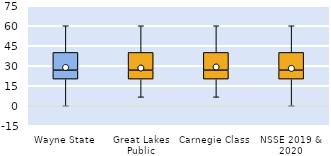
| Category | 25th | 50th | 75th |
|---|---|---|---|
| Wayne State | 20 | 6.667 | 13.333 |
| Great Lakes Public | 20 | 6.667 | 13.333 |
| Carnegie Class | 20 | 6.667 | 13.333 |
| NSSE 2019 & 2020 | 20 | 6.667 | 13.333 |